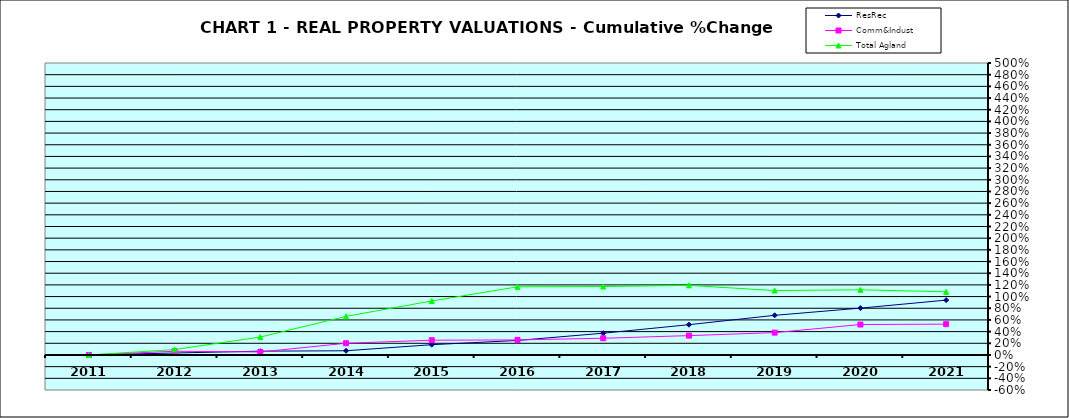
| Category | ResRec | Comm&Indust | Total Agland |
|---|---|---|---|
| 2011.0 | 0 | 0 | 0 |
| 2012.0 | 0.034 | 0.064 | 0.093 |
| 2013.0 | 0.065 | 0.051 | 0.307 |
| 2014.0 | 0.072 | 0.2 | 0.661 |
| 2015.0 | 0.176 | 0.253 | 0.924 |
| 2016.0 | 0.249 | 0.258 | 1.167 |
| 2017.0 | 0.373 | 0.286 | 1.172 |
| 2018.0 | 0.518 | 0.331 | 1.192 |
| 2019.0 | 0.679 | 0.382 | 1.103 |
| 2020.0 | 0.802 | 0.521 | 1.116 |
| 2021.0 | 0.939 | 0.527 | 1.082 |